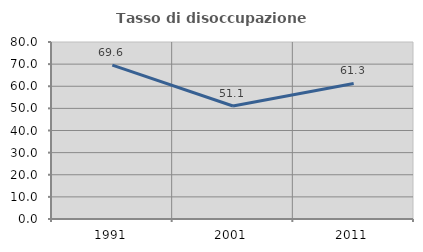
| Category | Tasso di disoccupazione giovanile  |
|---|---|
| 1991.0 | 69.556 |
| 2001.0 | 51.092 |
| 2011.0 | 61.277 |